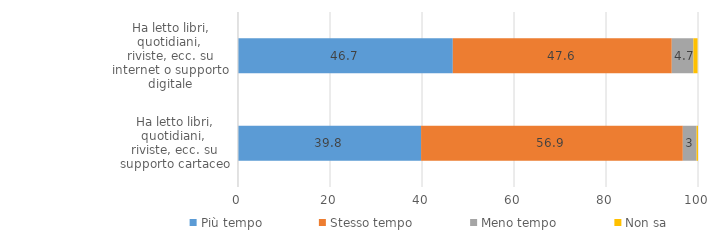
| Category | Più tempo | Stesso tempo | Meno tempo | Non sa  |
|---|---|---|---|---|
| Ha letto libri, quotidiani, 
riviste, ecc. su supporto cartaceo | 39.8 | 56.9 | 3 | 0.3 |
| Ha letto libri, quotidiani, 
riviste, ecc. su internet o supporto digitale | 46.7 | 47.6 | 4.7 | 0.9 |